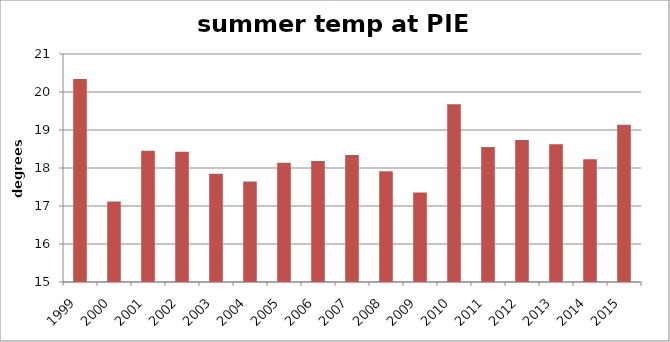
| Category | ttl winter precip |
|---|---|
| 1999.0 | 20.344 |
| 2000.0 | 17.121 |
| 2001.0 | 18.452 |
| 2002.0 | 18.43 |
| 2003.0 | 17.846 |
| 2004.0 | 17.644 |
| 2005.0 | 18.14 |
| 2006.0 | 18.187 |
| 2007.0 | 18.343 |
| 2008.0 | 17.914 |
| 2009.0 | 17.357 |
| 2010.0 | 19.679 |
| 2011.0 | 18.554 |
| 2012.0 | 18.734 |
| 2013.0 | 18.628 |
| 2014.0 | 18.232 |
| 2015.0 | 19.14 |